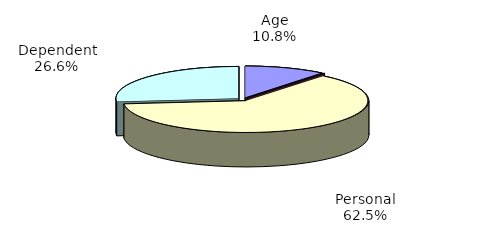
| Category | Series 0 |
|---|---|
| Age | 932456 |
| Blindness | 8996 |
| Personal | 5412829 |
| Dependent | 2302402 |